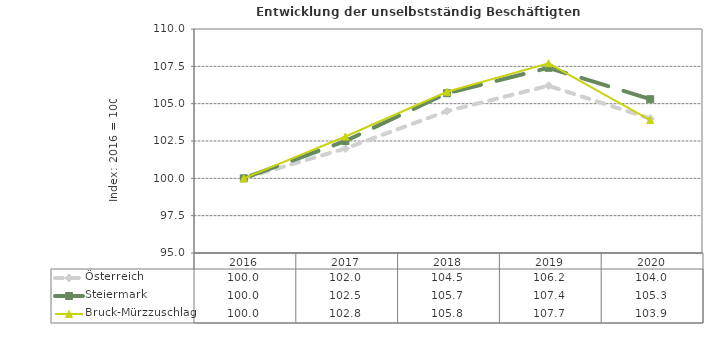
| Category | Österreich | Steiermark | Bruck-Mürzzuschlag |
|---|---|---|---|
| 2020.0 | 104 | 105.3 | 103.9 |
| 2019.0 | 106.2 | 107.4 | 107.7 |
| 2018.0 | 104.5 | 105.7 | 105.8 |
| 2017.0 | 102 | 102.5 | 102.8 |
| 2016.0 | 100 | 100 | 100 |